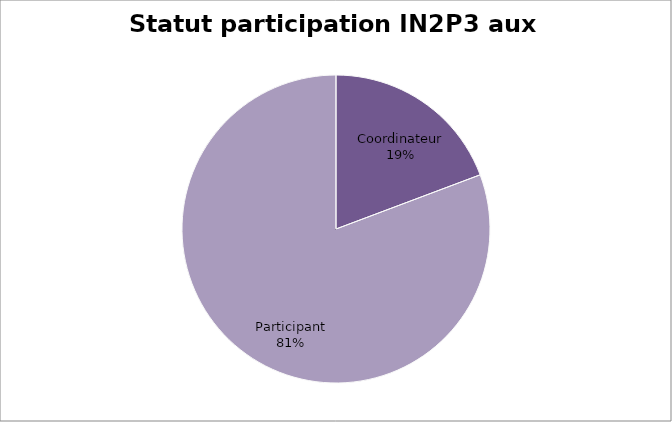
| Category | Series 0 |
|---|---|
| Coordinateur | 16 |
| Participant | 67 |